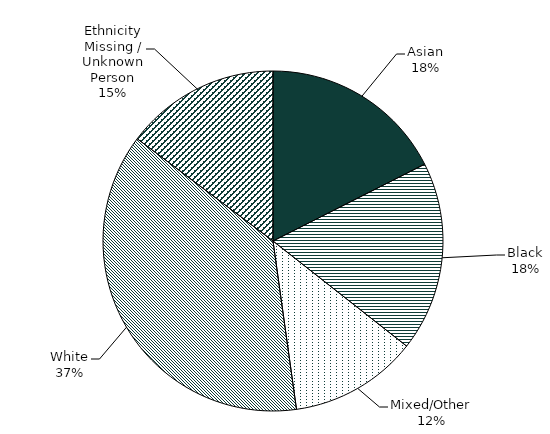
| Category | Series 0 |
|---|---|
| Asian | 131 |
| Black | 135 |
| Mixed/Other | 91 |
| White | 280 |
| Ethnicity Missing / Unknown Person | 110 |